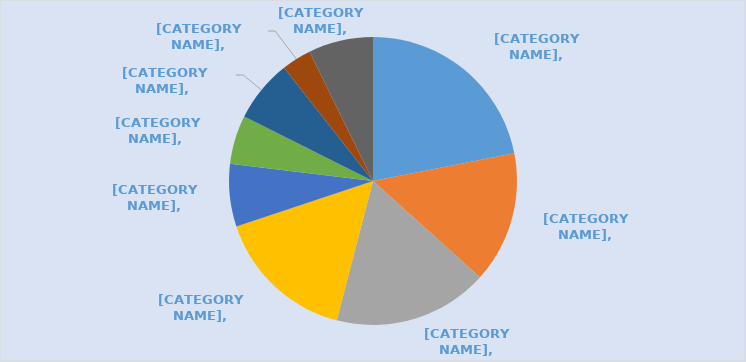
| Category | Series 0 |
|---|---|
| Managers and senior officials | 184 |
| Professional occupations | 124 |
| Associate professional and technical occupations | 146 |
| Administrative and secretarial occupations | 133 |
| Skilled trades occupations | 59 |
| Personal service occupations | 46 |
| Sales and customer service occupations | 59 |
| Process, plant and machine operatives | 28 |
| Elementary occupations | 61 |